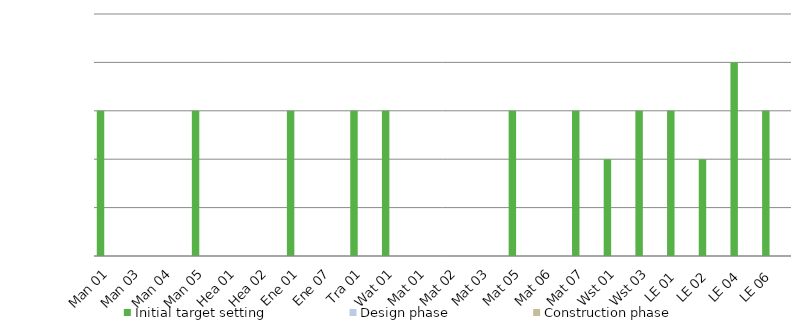
| Category | Initial target setting | Design phase | Construction phase |
|---|---|---|---|
| Man 01 | 3 | 0 | 0 |
| Man 03 | 0 | 0 | 0 |
| Man 04 | 0 | 0 | 0 |
| Man 05 | 3 | 0 | 0 |
| Hea 01 | 0 | 0 | 0 |
| Hea 02 | 0 | 0 | 0 |
| Ene 01 | 3 | 0 | 0 |
| Ene 07 | 0 | 0 | 0 |
| Tra 01 | 3 | 0 | 0 |
| Wat 01 | 3 | 0 | 0 |
| Mat 01 | 0 | 0 | 0 |
| Mat 02 | 0 | 0 | 0 |
| Mat 03 | 0 | 0 | 0 |
| Mat 05 | 3 | 0 | 0 |
| Mat 06 | 0 | 0 | 0 |
| Mat 07 | 3 | 0 | 0 |
| Wst 01 | 2 | 0 | 0 |
| Wst 03 | 3 | 0 | 0 |
| LE 01 | 3 | 0 | 0 |
| LE 02 | 2 | 0 | 0 |
| LE 04 | 4 | 0 | 0 |
| LE 06 | 3 | 0 | 0 |